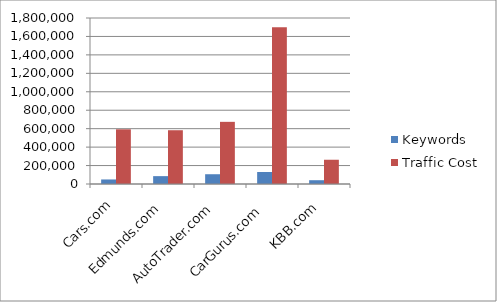
| Category | Keywords | Traffic Cost |
|---|---|---|
| Cars.com  | 49200 | 593000 |
| Edmunds.com  | 85300 | 583000 |
| AutoTrader.com   | 106000 | 674000 |
| CarGurus.com   | 130000 | 1700000 |
| KBB.com  | 41100 | 263000 |